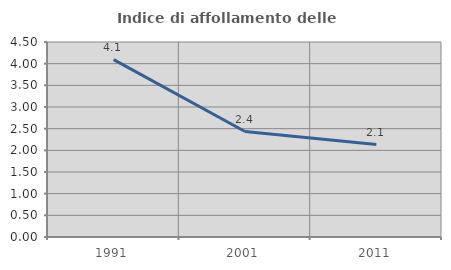
| Category | Indice di affollamento delle abitazioni  |
|---|---|
| 1991.0 | 4.092 |
| 2001.0 | 2.435 |
| 2011.0 | 2.134 |